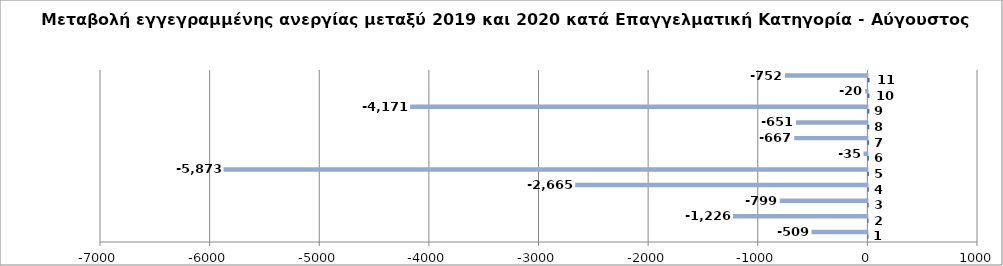
| Category | Series 0 | Series 1 |
|---|---|---|
| 0 | 1 | -509 |
| 1 | 2 | -1226 |
| 2 | 3 | -799 |
| 3 | 4 | -2665 |
| 4 | 5 | -5873 |
| 5 | 6 | -35 |
| 6 | 7 | -667 |
| 7 | 8 | -651 |
| 8 | 9 | -4171 |
| 9 | 10 | -20 |
| 10 | 11 | -752 |